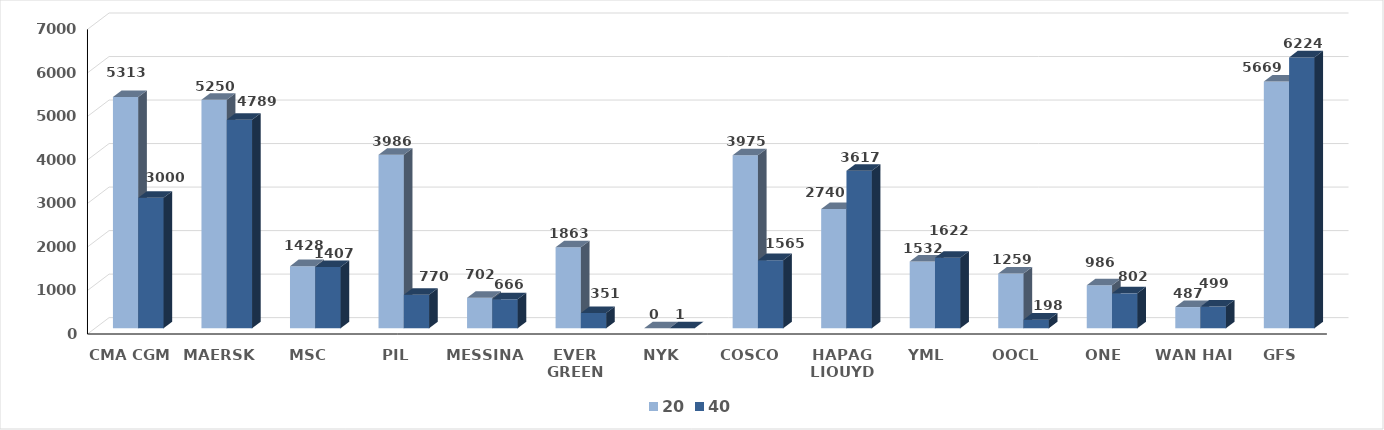
| Category | 20 | 40 |
|---|---|---|
| CMA CGM | 5313 | 3000 |
| MAERSK | 5250 | 4789 |
| MSC | 1428 | 1407 |
| PIL | 3986 | 770 |
| MESSINA | 702 | 666 |
| EVER GREEN | 1863 | 351 |
| NYK | 0 | 1 |
| COSCO | 3975 | 1565 |
| HAPAG LIOUYD | 2740 | 3617 |
| YML | 1532 | 1622 |
| OOCL | 1259 | 198 |
| ONE | 986 | 802 |
| WAN HAI | 487 | 499 |
| GFS | 5669 | 6224 |